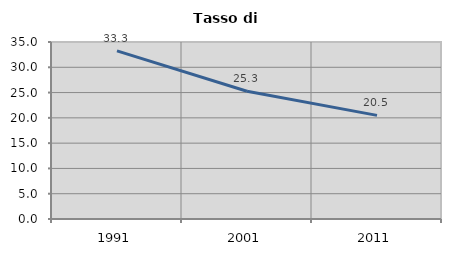
| Category | Tasso di disoccupazione   |
|---|---|
| 1991.0 | 33.258 |
| 2001.0 | 25.255 |
| 2011.0 | 20.489 |